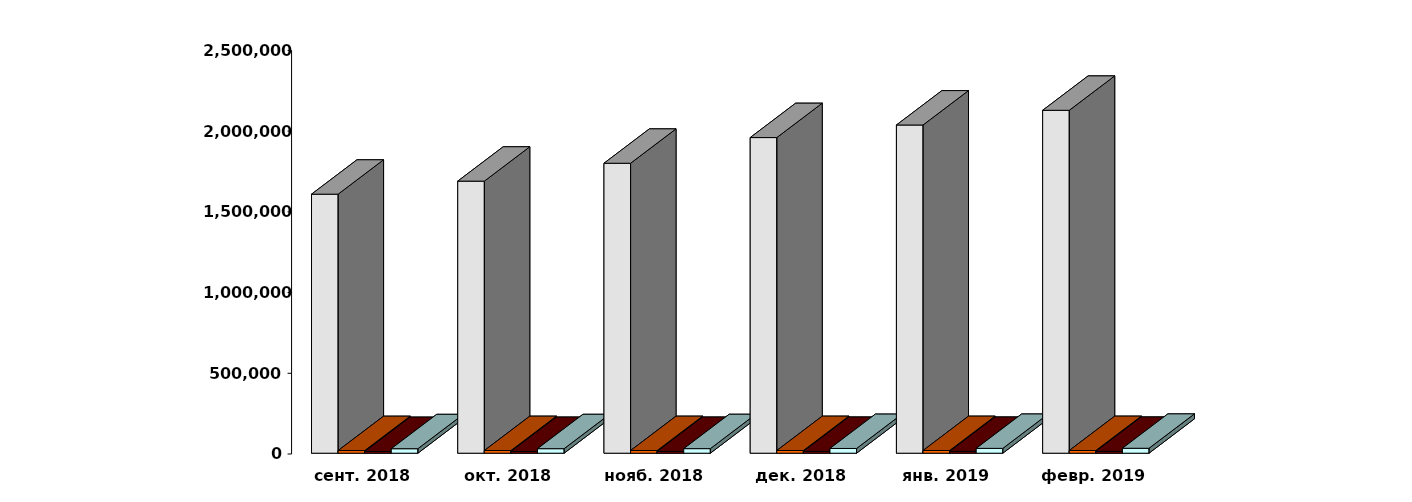
| Category | Физические лица | Юридические лица | Иностранные лица | Клиенты, передавшие свои средства в ДУ |
|---|---|---|---|---|
| 2018-09-28 | 1604456 | 16427 | 10655 | 27795 |
| 2018-10-28 | 1685168 | 16513 | 10989 | 28000 |
| 2018-11-28 | 1796071 | 16547 | 11151 | 28275 |
| 2018-12-28 | 1955118 | 16631 | 11453 | 29262 |
| 2019-01-28 | 2032931 | 16590 | 11564 | 29851 |
| 2019-02-28 | 2124042 | 16658 | 11740 | 30559 |